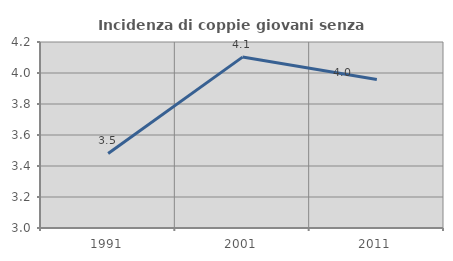
| Category | Incidenza di coppie giovani senza figli |
|---|---|
| 1991.0 | 3.481 |
| 2001.0 | 4.103 |
| 2011.0 | 3.958 |